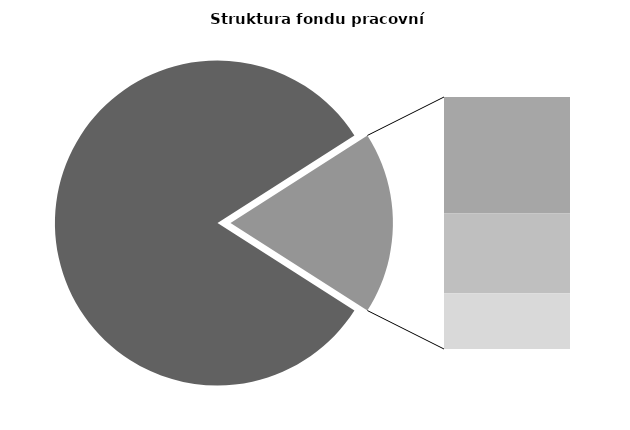
| Category | Series 0 |
|---|---|
| Průměrná měsíční odpracovaná doba bez přesčasu | 139.106 |
| Dovolená | 14.213 |
| Nemoc | 9.734 |
| Jiné | 6.822 |